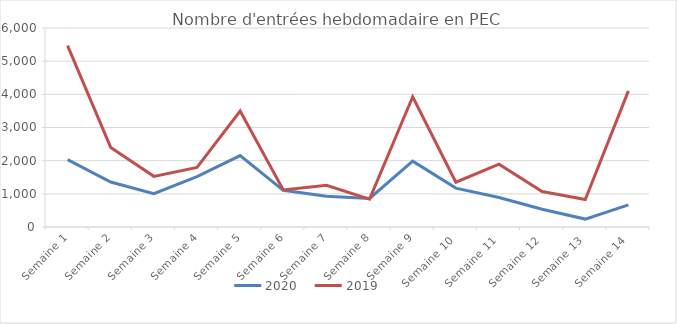
| Category | 2020 | 2019 |
|---|---|---|
| Semaine 1 | 2029 | 5470 |
| Semaine 2 | 1356 | 2400 |
| Semaine 3 | 1004 | 1527 |
| Semaine 4 | 1522 | 1798 |
| Semaine 5 | 2152 | 3495 |
| Semaine 6 | 1105 | 1116 |
| Semaine 7 | 924 | 1260 |
| Semaine 8 | 862 | 841 |
| Semaine 9 | 1986 | 3928 |
| Semaine 10 | 1173 | 1349 |
| Semaine 11 | 889 | 1893 |
| Semaine 12 | 534 | 1068 |
| Semaine 13 | 239 | 828 |
| Semaine 14 | 669 | 4105 |